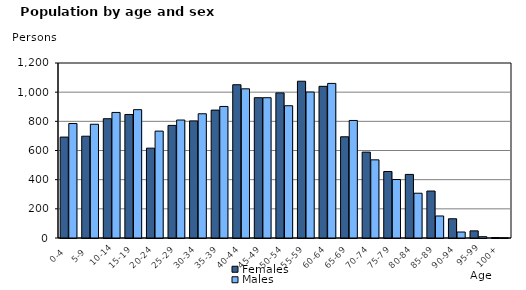
| Category | Females | Males |
|---|---|---|
|   0-4  | 692 | 785 |
|   5-9  | 698 | 780 |
| 10-14 | 818 | 861 |
| 15-19  | 847 | 880 |
| 20-24  | 616 | 733 |
| 25-29  | 772 | 809 |
| 30-34  | 803 | 852 |
| 35-39  | 877 | 902 |
| 40-44  | 1051 | 1023 |
| 45-49  | 962 | 962 |
| 50-54  | 995 | 907 |
| 55-59  | 1075 | 1001 |
| 60-64  | 1040 | 1060 |
| 65-69  | 694 | 806 |
| 70-74  | 589 | 536 |
| 75-79  | 456 | 401 |
| 80-84  | 436 | 307 |
| 85-89  | 322 | 151 |
| 90-94  | 132 | 41 |
| 95-99 | 49 | 9 |
| 100+ | 3 | 1 |